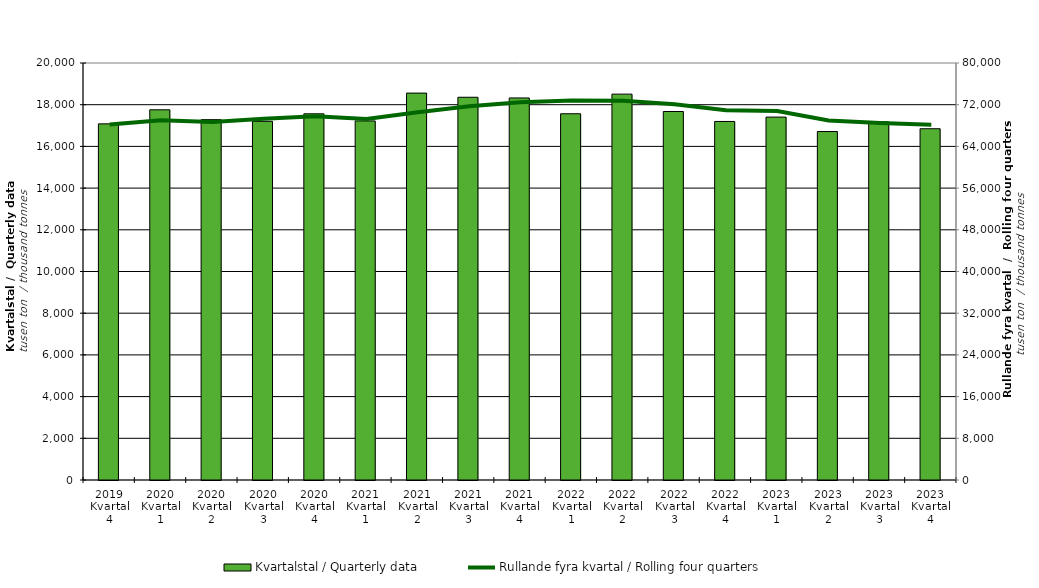
| Category | Kvartalstal / Quarterly data |
|---|---|
| 2019 Kvartal 4 | 17080.691 |
| 2020 Kvartal 1 | 17755.324 |
| 2020 Kvartal 2 | 17283.081 |
| 2020 Kvartal 3 | 17203.185 |
| 2020 Kvartal 4 | 17563.403 |
| 2021 Kvartal 1 | 17221.505 |
| 2021 Kvartal 2 | 18556.292 |
| 2021 Kvartal 3 | 18357.009 |
| 2021 Kvartal 4 | 18323.49 |
| 2022 Kvartal 1 | 17565.59 |
| 2022 Kvartal 2 | 18506.797 |
| 2022 Kvartal 3 | 17673.481 |
| 2022 Kvartal 4 | 17195.877 |
| 2023 Kvartal 1 | 17405.178 |
| 2023 Kvartal 2 | 16712.409 |
| 2023 Kvartal 3 | 17180.586 |
| 2023 Kvartal 4 | 16847.682 |